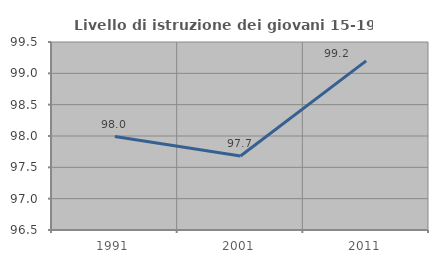
| Category | Livello di istruzione dei giovani 15-19 anni |
|---|---|
| 1991.0 | 97.991 |
| 2001.0 | 97.68 |
| 2011.0 | 99.198 |